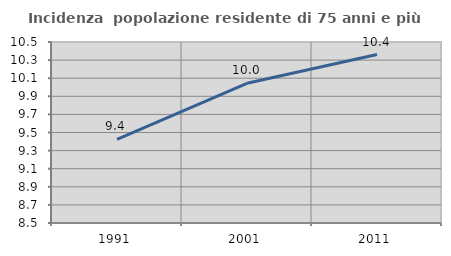
| Category | Incidenza  popolazione residente di 75 anni e più |
|---|---|
| 1991.0 | 9.424 |
| 2001.0 | 10.043 |
| 2011.0 | 10.362 |